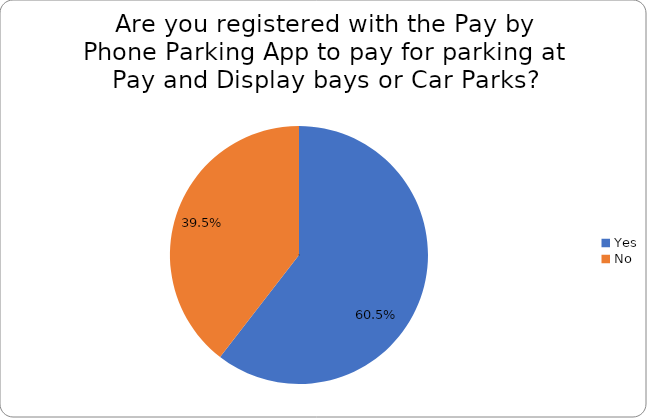
| Category | Series 0 |
|---|---|
| Yes | 0.605 |
| No | 0.395 |